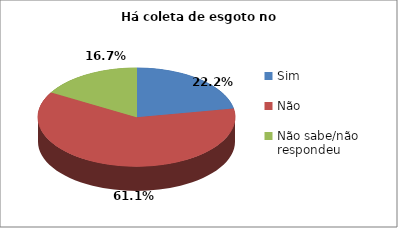
| Category | Series 0 |
|---|---|
| Sim | 8 |
| Não | 22 |
| Não sabe/não respondeu | 6 |